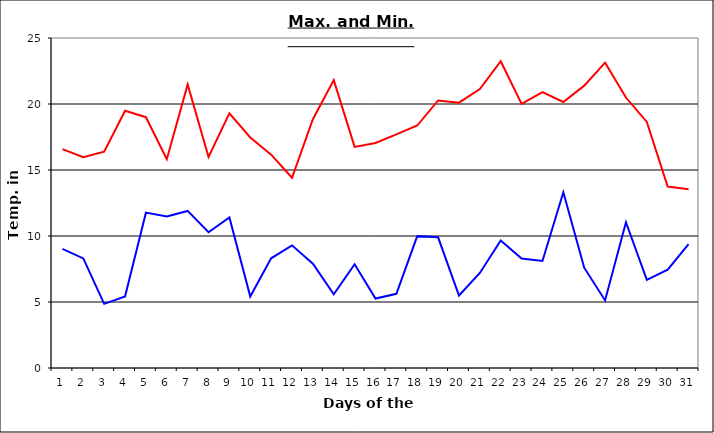
| Category | Series 0 | Series 1 |
|---|---|---|
| 0 | 16.58 | 9.02 |
| 1 | 15.97 | 8.3 |
| 2 | 16.39 | 4.86 |
| 3 | 19.49 | 5.42 |
| 4 | 19 | 11.77 |
| 5 | 15.82 | 11.48 |
| 6 | 21.48 | 11.9 |
| 7 | 15.99 | 10.28 |
| 8 | 19.29 | 11.41 |
| 9 | 17.46 | 5.42 |
| 10 | 16.16 | 8.31 |
| 11 | 14.41 | 9.29 |
| 12 | 18.85 | 7.9 |
| 13 | 21.81 | 5.59 |
| 14 | 16.75 | 7.86 |
| 15 | 17.05 | 5.26 |
| 16 | 17.7 | 5.62 |
| 17 | 18.37 | 9.99 |
| 18 | 20.27 | 9.9 |
| 19 | 20.1 | 5.49 |
| 20 | 21.13 | 7.2 |
| 21 | 23.24 | 9.66 |
| 22 | 20.01 | 8.3 |
| 23 | 20.9 | 8.11 |
| 24 | 20.15 | 13.31 |
| 25 | 21.39 | 7.6 |
| 26 | 23.13 | 5.12 |
| 27 | 20.49 | 11.04 |
| 28 | 18.64 | 6.68 |
| 29 | 13.75 | 7.45 |
| 30 | 13.54 | 9.39 |